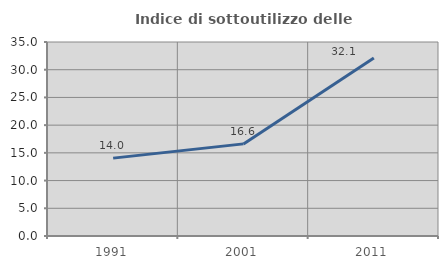
| Category | Indice di sottoutilizzo delle abitazioni  |
|---|---|
| 1991.0 | 14.05 |
| 2001.0 | 16.62 |
| 2011.0 | 32.107 |